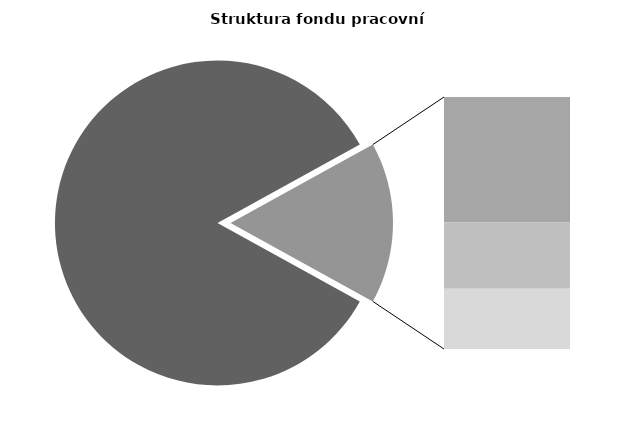
| Category | Series 0 |
|---|---|
| Průměrná měsíční odpracovaná doba bez přesčasu | 142.92 |
| Dovolená | 13.557 |
| Nemoc | 7.2 |
| Jiné | 6.526 |